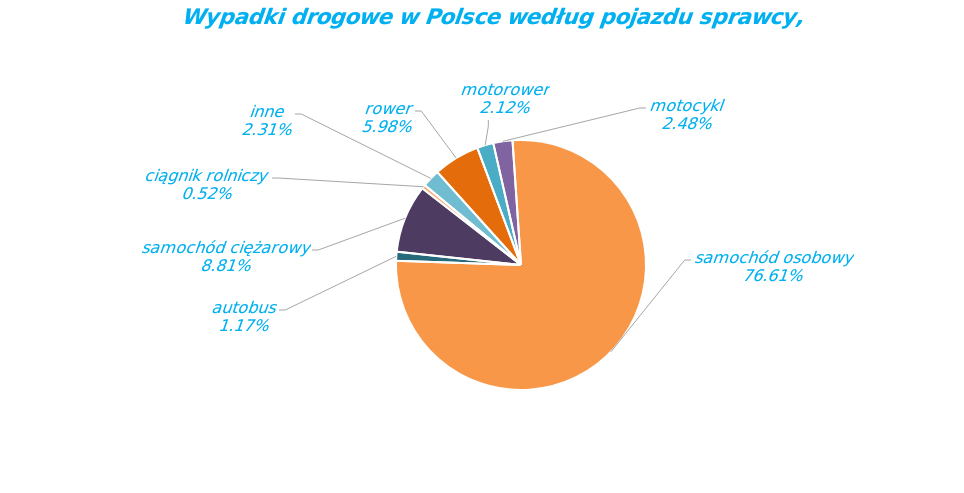
| Category | Series 0 |
|---|---|
| rower | 2299 |
| motorower | 815 |
| motocykl | 953 |
| samochód osobowy | 29445 |
| autobus | 450 |
| samochód ciężarowy | 3387 |
| ciągnik rolniczy | 197 |
| inne | 888 |